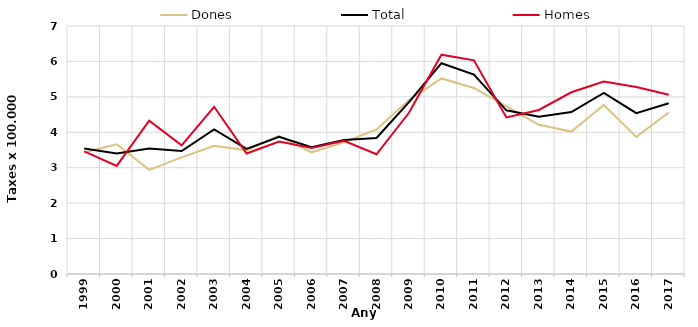
| Category | Dones | Total | Homes |
|---|---|---|---|
| 1999.0 | 3.43 | 3.54 | 3.46 |
| 2000.0 | 3.66 | 3.4 | 3.05 |
| 2001.0 | 2.94 | 3.54 | 4.33 |
| 2002.0 | 3.29 | 3.47 | 3.63 |
| 2003.0 | 3.62 | 4.08 | 4.72 |
| 2004.0 | 3.49 | 3.53 | 3.4 |
| 2005.0 | 3.9 | 3.87 | 3.74 |
| 2006.0 | 3.43 | 3.58 | 3.56 |
| 2007.0 | 3.72 | 3.78 | 3.76 |
| 2008.0 | 4.08 | 3.84 | 3.38 |
| 2009.0 | 4.91 | 4.85 | 4.55 |
| 2010.0 | 5.52 | 5.95 | 6.19 |
| 2011.0 | 5.25 | 5.63 | 6.03 |
| 2012.0 | 4.73 | 4.62 | 4.42 |
| 2013.0 | 4.21 | 4.44 | 4.63 |
| 2014.0 | 4.02 | 4.57 | 5.13 |
| 2015.0 | 4.77 | 5.11 | 5.43 |
| 2016.0 | 3.87 | 4.54 | 5.28 |
| 2017.0 | 4.56 | 4.82 | 5.06 |